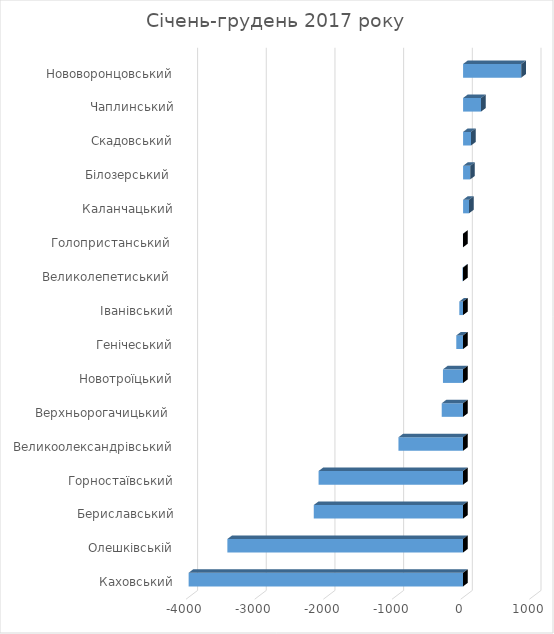
| Category | Series 0 |
|---|---|
| Каховський | -3996 |
| Олешківській | -3432 |
| Бериславський | -2174 |
| Горностаївський | -2104 |
| Великоолександрівський | -941 |
| Верхньорогачицький  | -311 |
| Новотроїцький | -293 |
| Генічеський | -99 |
| Іванівський | -55 |
| Великолепетиський  | -9 |
| Голопристанський  | -2 |
| Каланчацький | 86 |
| Білозерський  | 104 |
| Скадовський | 116 |
| Чаплинський | 262 |
| Нововоронцовський | 847 |